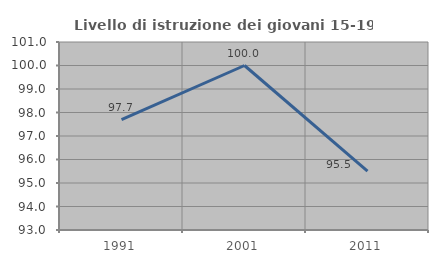
| Category | Livello di istruzione dei giovani 15-19 anni |
|---|---|
| 1991.0 | 97.701 |
| 2001.0 | 100 |
| 2011.0 | 95.506 |